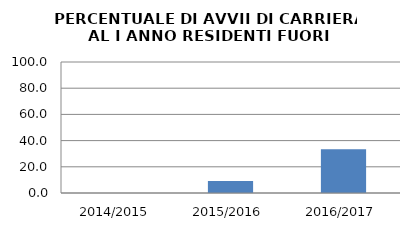
| Category | 2014/2015 2015/2016 2016/2017 |
|---|---|
| 2014/2015 | 0 |
| 2015/2016 | 9.091 |
| 2016/2017 | 33.333 |